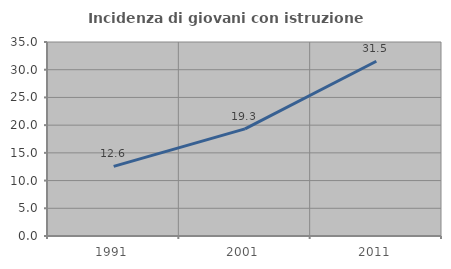
| Category | Incidenza di giovani con istruzione universitaria |
|---|---|
| 1991.0 | 12.555 |
| 2001.0 | 19.334 |
| 2011.0 | 31.525 |